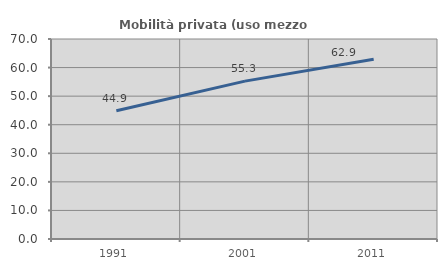
| Category | Mobilità privata (uso mezzo privato) |
|---|---|
| 1991.0 | 44.902 |
| 2001.0 | 55.25 |
| 2011.0 | 62.907 |